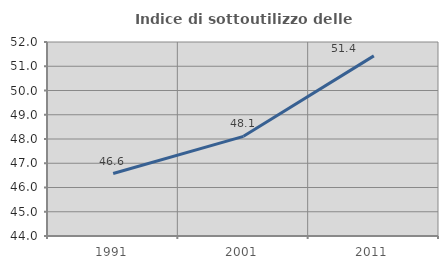
| Category | Indice di sottoutilizzo delle abitazioni  |
|---|---|
| 1991.0 | 46.575 |
| 2001.0 | 48.11 |
| 2011.0 | 51.429 |